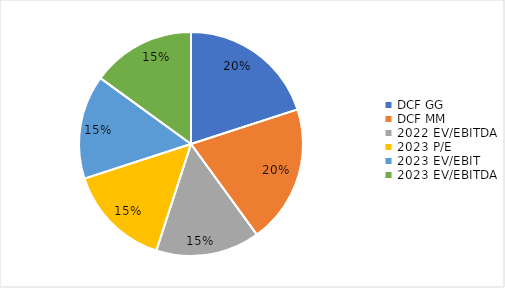
| Category | Weight |
|---|---|
| DCF GG | 0.2 |
| DCF MM | 0.2 |
| 2022 EV/EBITDA | 0.15 |
| 2023 P/E | 0.15 |
| 2023 EV/EBIT | 0.15 |
| 2023 EV/EBITDA | 0.15 |